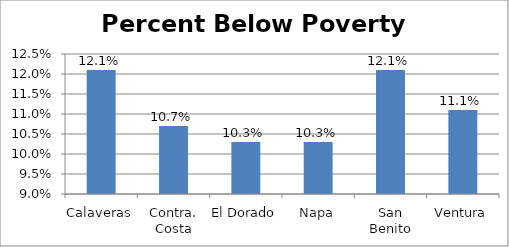
| Category | Series 0 |
|---|---|
| Calaveras | 0.121 |
| Contra. Costa | 0.107 |
| El Dorado | 0.103 |
| Napa | 0.103 |
| San Benito | 0.121 |
| Ventura | 0.111 |